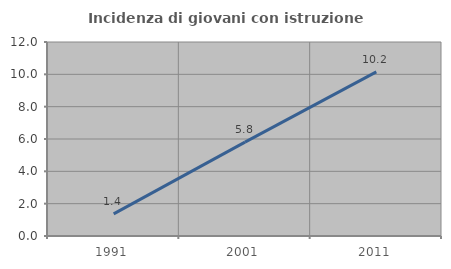
| Category | Incidenza di giovani con istruzione universitaria |
|---|---|
| 1991.0 | 1.37 |
| 2001.0 | 5.806 |
| 2011.0 | 10.156 |